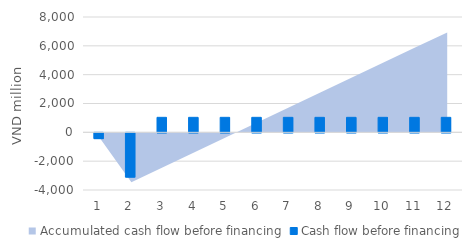
| Category | Cash flow before financing |
|---|---|
| 1.0 | -400 |
| 2.0 | -3069.11 |
| 3.0 | 1040.243 |
| 4.0 | 1040.243 |
| 5.0 | 1040.243 |
| 6.0 | 1040.243 |
| 7.0 | 1040.243 |
| 8.0 | 1040.243 |
| 9.0 | 1040.243 |
| 10.0 | 1040.243 |
| 11.0 | 1040.243 |
| 12.0 | 1040.243 |